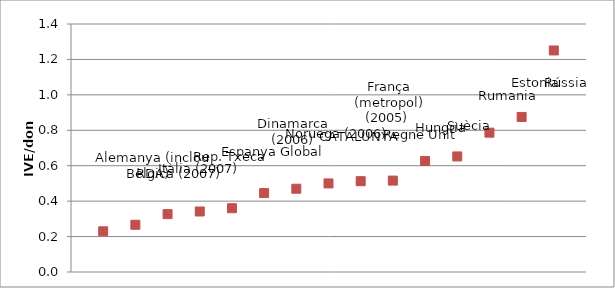
| Category | Series 1 |
|---|---|
| 0 | 0.23 |
| 1 | 0.267 |
| 2 | 0.327 |
| 3 | 0.342 |
| 4 | 0.36 |
| 5 | 0.445 |
| 6 | 0.47 |
| 7 | 0.5 |
| 8 | 0.513 |
| 9 | 0.516 |
| 10 | 0.626 |
| 11 | 0.652 |
| 12 | 0.787 |
| 13 | 0.875 |
| 14 | 1.251 |